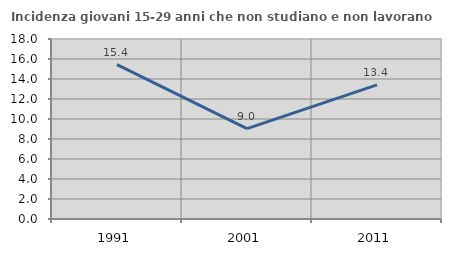
| Category | Incidenza giovani 15-29 anni che non studiano e non lavorano  |
|---|---|
| 1991.0 | 15.438 |
| 2001.0 | 9.039 |
| 2011.0 | 13.415 |